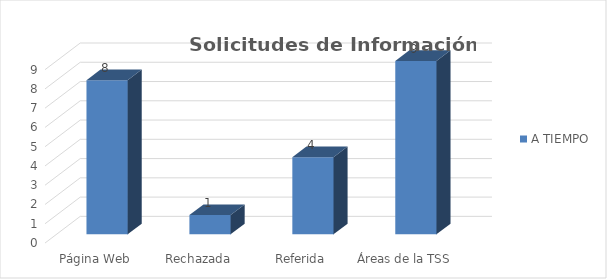
| Category | A TIEMPO |
|---|---|
| Página Web | 8 |
| Rechazada | 1 |
| Referida | 4 |
| Áreas de la TSS | 9 |